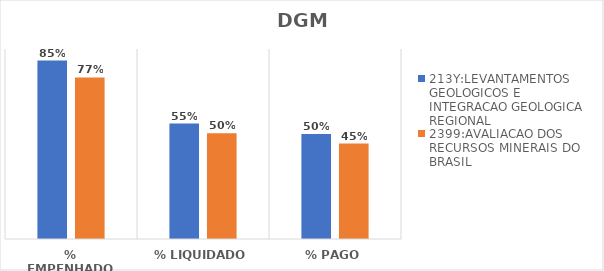
| Category | 213Y:LEVANTAMENTOS GEOLOGICOS E INTEGRACAO GEOLOGICA REGIONAL | 2399:AVALIACAO DOS RECURSOS MINERAIS DO BRASIL |
|---|---|---|
| % EMPENHADO | 0.845 | 0.765 |
| % LIQUIDADO | 0.547 | 0.501 |
| % PAGO | 0.497 | 0.452 |